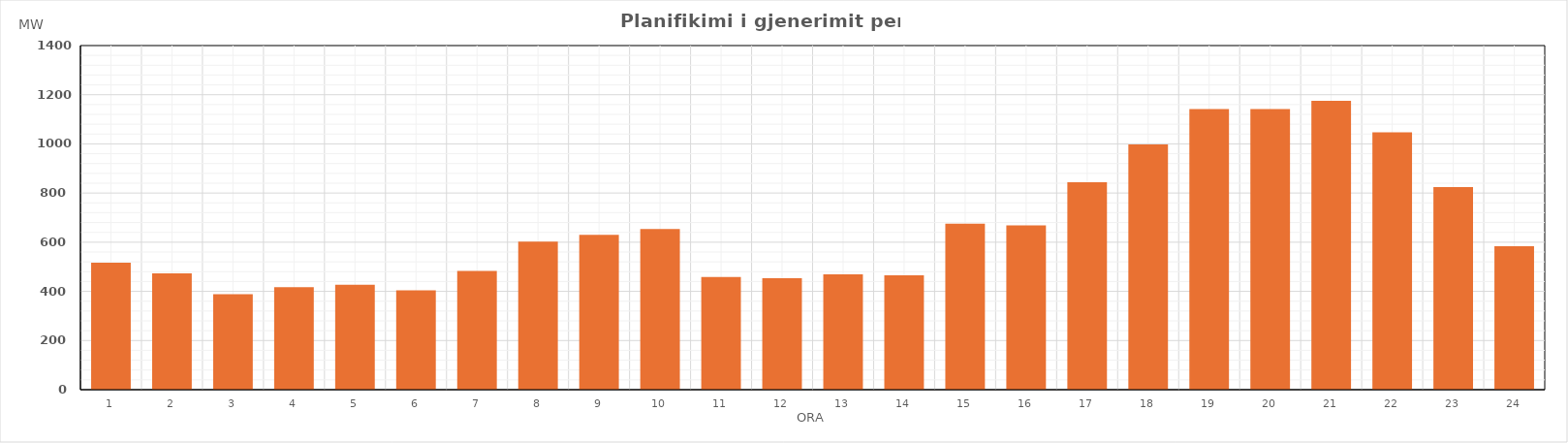
| Category | Max (MW) |
|---|---|
| 0 | 516.95 |
| 1 | 473.15 |
| 2 | 388.53 |
| 3 | 416.74 |
| 4 | 427.34 |
| 5 | 403.86 |
| 6 | 483.21 |
| 7 | 602.66 |
| 8 | 629.89 |
| 9 | 653.9 |
| 10 | 458.36 |
| 11 | 453.97 |
| 12 | 469.31 |
| 13 | 465.53 |
| 14 | 675.13 |
| 15 | 668.83 |
| 16 | 844.38 |
| 17 | 997.26 |
| 18 | 1141.64 |
| 19 | 1142.07 |
| 20 | 1175.2 |
| 21 | 1046.64 |
| 22 | 824.57 |
| 23 | 583.24 |